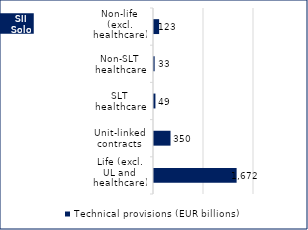
| Category | Technical provisions (EUR billions) | Whose : | Best estimate | Risk margin |
|---|---|---|---|---|
| Life (excl. UL and healthcare) | 1672.352 |  |  |  |
| Unit-linked contracts | 350.458 |  |  |  |
| SLT healthcare | 48.628 |  |  |  |
| Non-SLT healthcare | 32.899 |  |  |  |
| Non-life (excl. healthcare) | 122.693 |  |  |  |